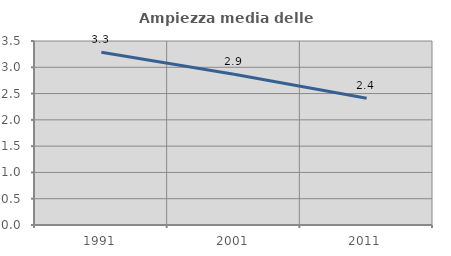
| Category | Ampiezza media delle famiglie |
|---|---|
| 1991.0 | 3.286 |
| 2001.0 | 2.867 |
| 2011.0 | 2.411 |